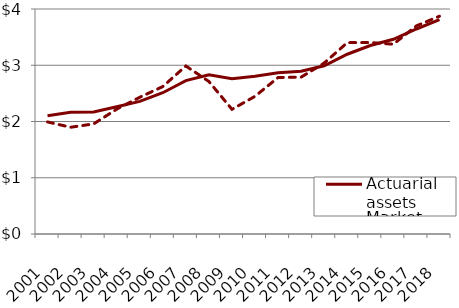
| Category | Actuarial assets | Market assets |
|---|---|---|
| 2001.0 | 2100408359 | 1992408891 |
| 2002.0 | 2166139670 | 1897618505 |
| 2003.0 | 2167864032 | 1957206900 |
| 2004.0 | 2263577627 | 2219071330 |
| 2005.0 | 2357628672 | 2430680831 |
| 2006.0 | 2511452020 | 2621277810 |
| 2007.0 | 2726922774 | 2986960700 |
| 2008.0 | 2829013393 | 2711304587 |
| 2009.0 | 2759238147 | 2216365981 |
| 2010.0 | 2803717546 | 2448045334 |
| 2011.0 | 2866044895 | 2781640221 |
| 2012.0 | 2893159810 | 2789204960 |
| 2013.0 | 2991279647 | 3038915206 |
| 2014.0 | 3195878944 | 3402026765 |
| 2015.0 | 3351430709 | 3403883373 |
| 2016.0 | 3462227909 | 3373851927 |
| 2017.0 | 3644639033 | 3700299631 |
| 2018.0 | 3812018936 | 3871815205 |